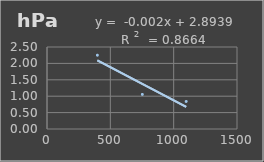
| Category | Presión Atmosférica |
|---|---|
| 397.704 | 2.25 |
| 752.713 | 1.055 |
| 1098.79 | 0.84 |